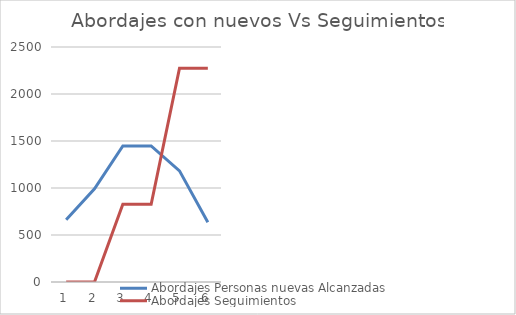
| Category | Abordajes Personas nuevas Alcanzadas | Abordajes Seguimientos |
|---|---|---|
| 0 | 661.44 | 0 |
| 1 | 992.16 | 0 |
| 2 | 1446.9 | 826.8 |
| 3 | 1446.9 | 826.8 |
| 4 | 1182.324 | 2273.7 |
| 5 | 636.636 | 2273.7 |